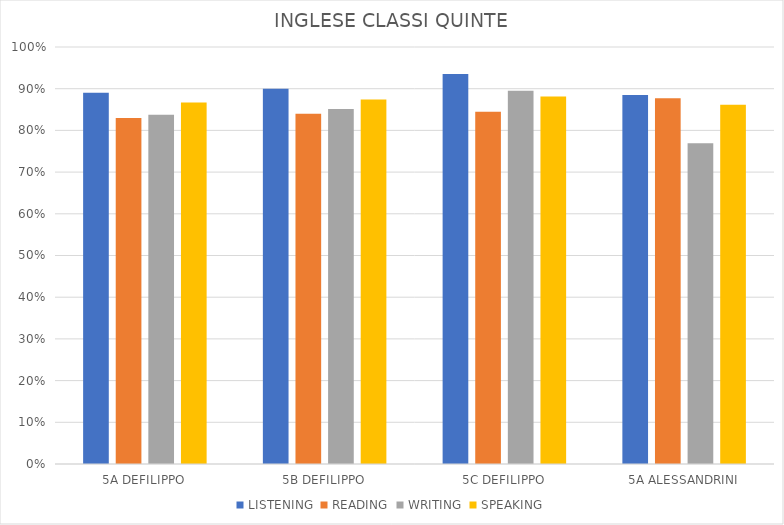
| Category | LISTENING | READING | WRITING | SPEAKING |
|---|---|---|---|---|
| 5A DEFILIPPO | 0.89 | 0.83 | 0.838 | 0.867 |
| 5B DEFILIPPO | 0.9 | 0.84 | 0.851 | 0.874 |
| 5C DEFILIPPO | 0.935 | 0.845 | 0.895 | 0.882 |
| 5A ALESSANDRINI | 0.885 | 0.877 | 0.769 | 0.862 |